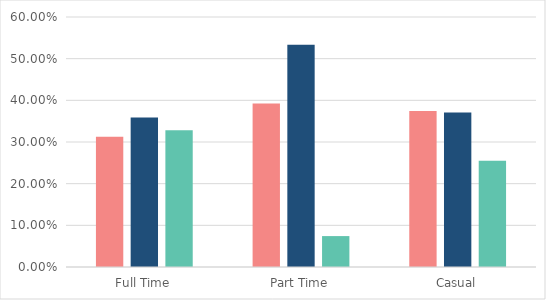
| Category | Education sector | Health sector | Rest of sector |
|---|---|---|---|
| Full Time | 0.313 | 0.359 | 0.328 |
| Part Time | 0.393 | 0.533 | 0.074 |
| Casual | 0.374 | 0.371 | 0.255 |